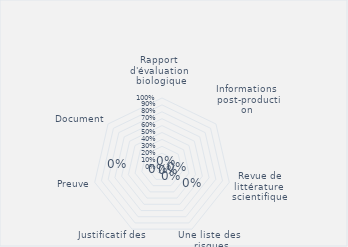
| Category | Rapport  
d'évaluation  
biologique  |
|---|---|
| Rapport  
d'évaluation  
biologique  | 0 |
| Informations  
post-production  | 0 |
| Revue de littérature  
scientifique  | 0 |
| Une liste des  
risques biologiques  | 0 |
| Justificatif des  
essais supplémentaires  | 0 |
| Preuve | 0 |
| Document | 0 |